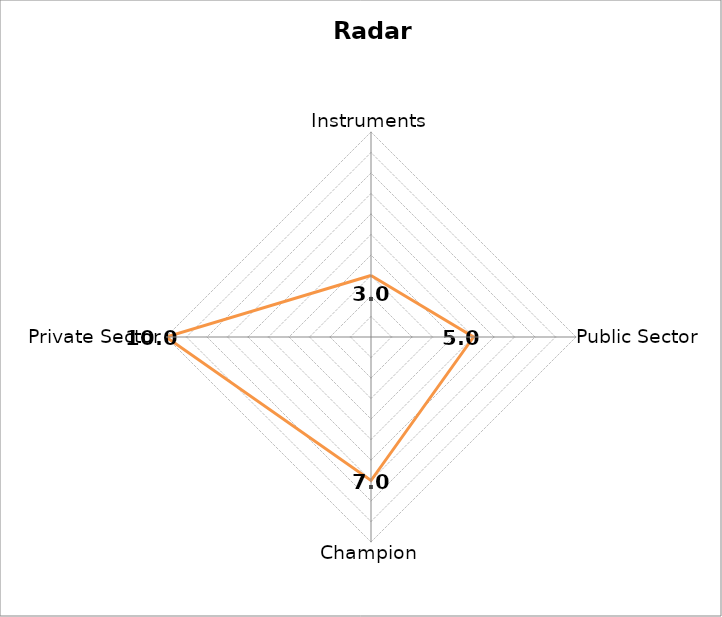
| Category | Instruments |
|---|---|
| Instruments | 3 |
| Public Sector | 5 |
| Champion | 7 |
| Private Sector | 10 |